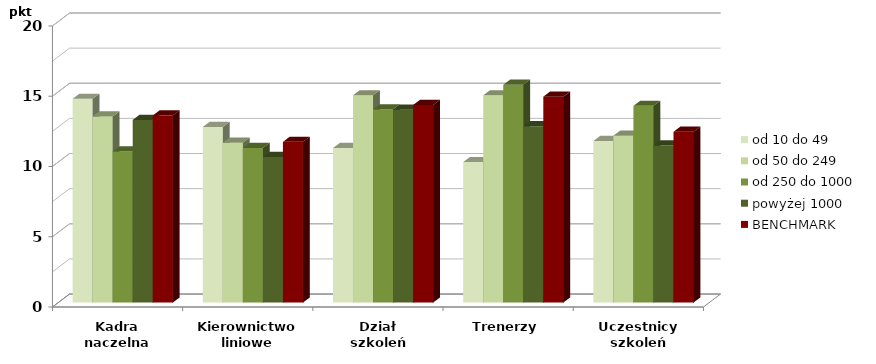
| Category | od 10 do 49 | od 50 do 249 | od 250 do 1000 | powyżej 1000 | BENCHMARK |
|---|---|---|---|---|---|
| Kadra
naczelna | 14.5 | 13.25 | 10.75 | 13 | 13.312 |
| Kierownictwo
liniowe | 12.5 | 11.375 | 11 | 10.364 | 11.438 |
| Dział
szkoleń | 11 | 14.75 | 13.75 | 13.727 | 14.062 |
| Trenerzy | 10 | 14.75 | 15.5 | 12.545 | 14.656 |
| Uczestnicy
szkoleń | 11.5 | 11.875 | 14 | 11.182 | 12.156 |